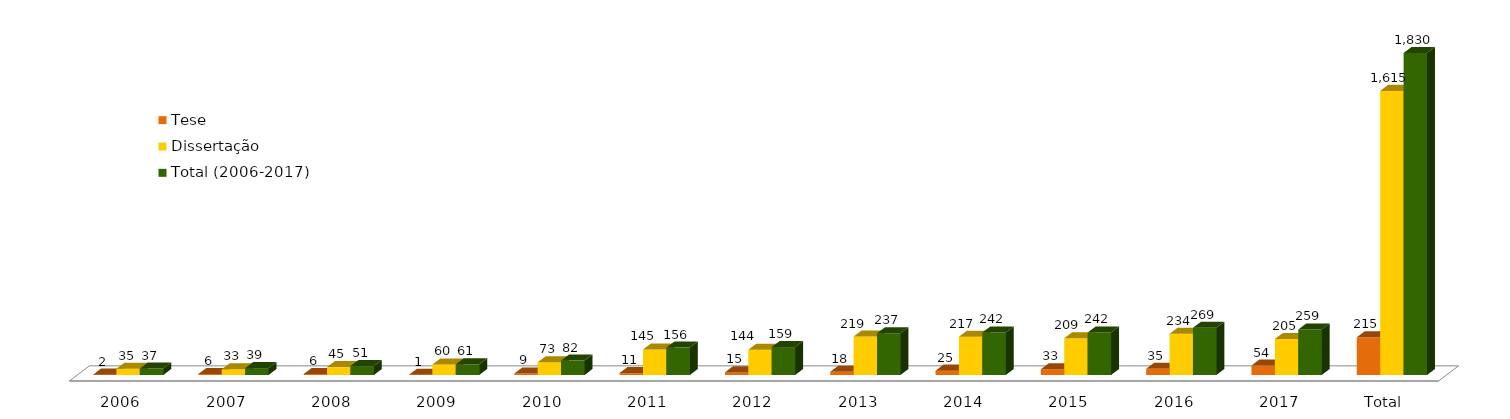
| Category | Tese | Dissertação | Total (2006-2017) |
|---|---|---|---|
| 0 | 2 | 35 | 37 |
| 1 | 6 | 33 | 39 |
| 2 | 6 | 45 | 51 |
| 3 | 1 | 60 | 61 |
| 4 | 9 | 73 | 82 |
| 5 | 11 | 145 | 156 |
| 6 | 15 | 144 | 159 |
| 7 | 18 | 219 | 237 |
| 8 | 25 | 217 | 242 |
| 9 | 33 | 209 | 242 |
| 10 | 35 | 234 | 269 |
| 11 | 54 | 205 | 259 |
| 12 | 215 | 1615 | 1830 |